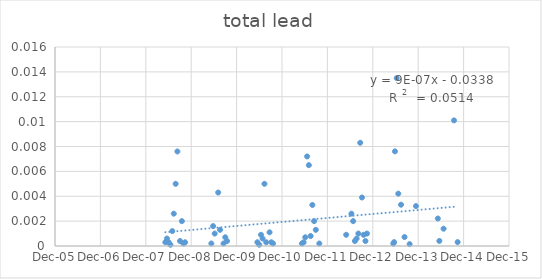
| Category | Series 0 |
|---|---|
| 39577.0 | 0 |
| 39590.0 | 0.001 |
| 39604.0 | 0 |
| 39618.0 | 0 |
| 39633.0 | 0.001 |
| 39645.0 | 0.003 |
| 39660.0 | 0.005 |
| 39674.0 | 0.008 |
| 39695.0 | 0 |
| 39710.0 | 0.002 |
| 39723.0 | 0 |
| 39736.0 | 0 |
| 39947.0 | 0 |
| 39961.0 | 0.002 |
| 39974.0 | 0.001 |
| 40002.0 | 0.004 |
| 40017.0 | 0.001 |
| 40045.0 | 0 |
| 40059.0 | 0.001 |
| 40073.0 | 0 |
| 40317.0 | 0 |
| 40332.0 | 0 |
| 40346.0 | 0.001 |
| 40359.0 | 0.001 |
| 40374.0 | 0.005 |
| 40388.0 | 0 |
| 40415.0 | 0.001 |
| 40429.0 | 0 |
| 40443.0 | 0 |
| 40675.0 | 0 |
| 40689.0 | 0 |
| 40702.0 | 0.001 |
| 40717.0 | 0.007 |
| 40731.0 | 0.006 |
| 40745.0 | 0.001 |
| 40759.0 | 0.003 |
| 40773.0 | 0.002 |
| 40787.0 | 0.001 |
| 40815.0 | 0 |
| 41031.0 | 0.001 |
| 41073.0 | 0.003 |
| 41087.0 | 0.002 |
| 41101.0 | 0 |
| 41115.0 | 0.001 |
| 41129.0 | 0.001 |
| 41144.0 | 0.008 |
| 41158.0 | 0.004 |
| 41171.0 | 0.001 |
| 41186.0 | 0 |
| 41198.0 | 0.001 |
| 41410.0 | 0 |
| 41416.0 | 0 |
| 41423.0 | 0.008 |
| 41437.0 | 0.014 |
| 41450.0 | 0.004 |
| 41472.0 | 0.003 |
| 41500.0 | 0.001 |
| 41541.0 | 0 |
| 41592.0 | 0.003 |
| 41768.0 | 0.002 |
| 41780.0 | 0 |
| 41814.0 | 0.001 |
| 41898.0 | 0.01 |
| 41927.0 | 0 |